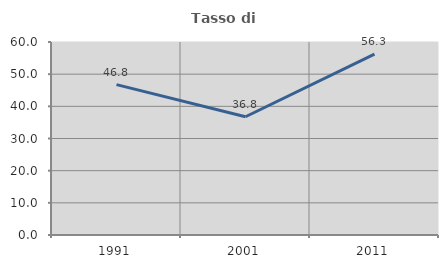
| Category | Tasso di occupazione   |
|---|---|
| 1991.0 | 46.753 |
| 2001.0 | 36.765 |
| 2011.0 | 56.25 |